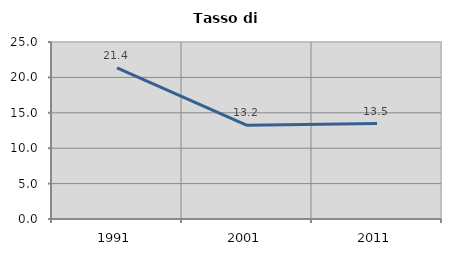
| Category | Tasso di disoccupazione   |
|---|---|
| 1991.0 | 21.358 |
| 2001.0 | 13.226 |
| 2011.0 | 13.481 |